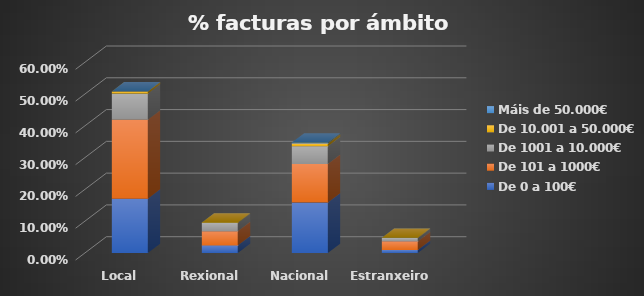
| Category | De 0 a 100€ | De 101 a 1000€ | De 1001 a 10.000€ | De 10.001 a 50.000€ | Máis de 50.000€ |
|---|---|---|---|---|---|
| Local | 0.171 | 0.248 | 0.082 | 0.006 | 0 |
| Rexional | 0.024 | 0.045 | 0.026 | 0.002 | 0 |
| Nacional | 0.159 | 0.121 | 0.056 | 0.009 | 0.003 |
| Estranxeiro | 0.01 | 0.027 | 0.011 | 0.001 | 0 |